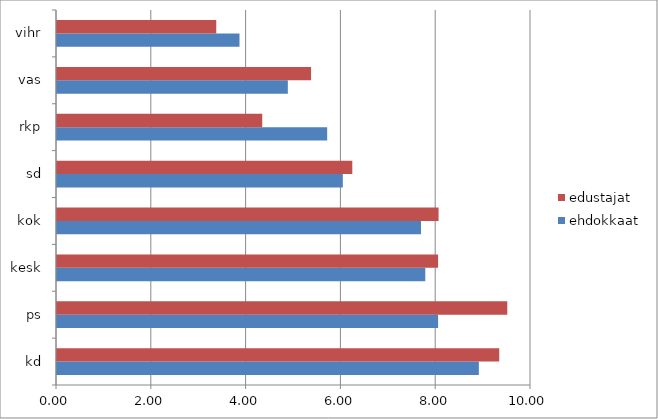
| Category | ehdokkaat | edustajat |
|---|---|---|
| kd | 8.9 | 9.33 |
| ps | 8.04 | 9.5 |
| kesk | 7.77 | 8.04 |
| kok | 7.68 | 8.05 |
| sd | 6.03 | 6.23 |
| rkp | 5.7 | 4.33 |
| vas | 4.87 | 5.36 |
| vihr | 3.85 | 3.36 |